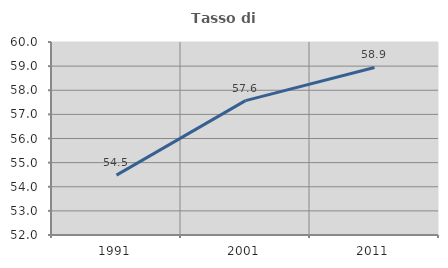
| Category | Tasso di occupazione   |
|---|---|
| 1991.0 | 54.481 |
| 2001.0 | 57.571 |
| 2011.0 | 58.945 |